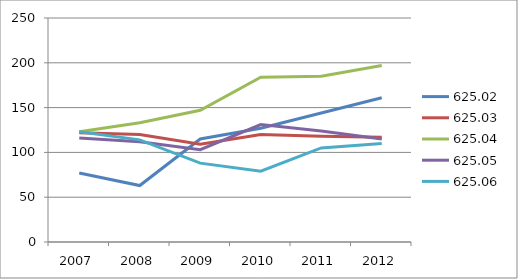
| Category | 625.02 | 625.03 | 625.04 | 625.05 | 625.06 |
|---|---|---|---|---|---|
| 2007 | 77 | 122 | 123 | 116 | 123 |
| 2008 | 63 | 120 | 133 | 112 | 114 |
| 2009 | 115 | 109 | 147 | 103 | 88 |
| 2010 | 127 | 120 | 184 | 131 | 79 |
| 2011 | 144 | 118 | 185 | 124 | 105 |
| 2012 | 161 | 117 | 197 | 115 | 110 |